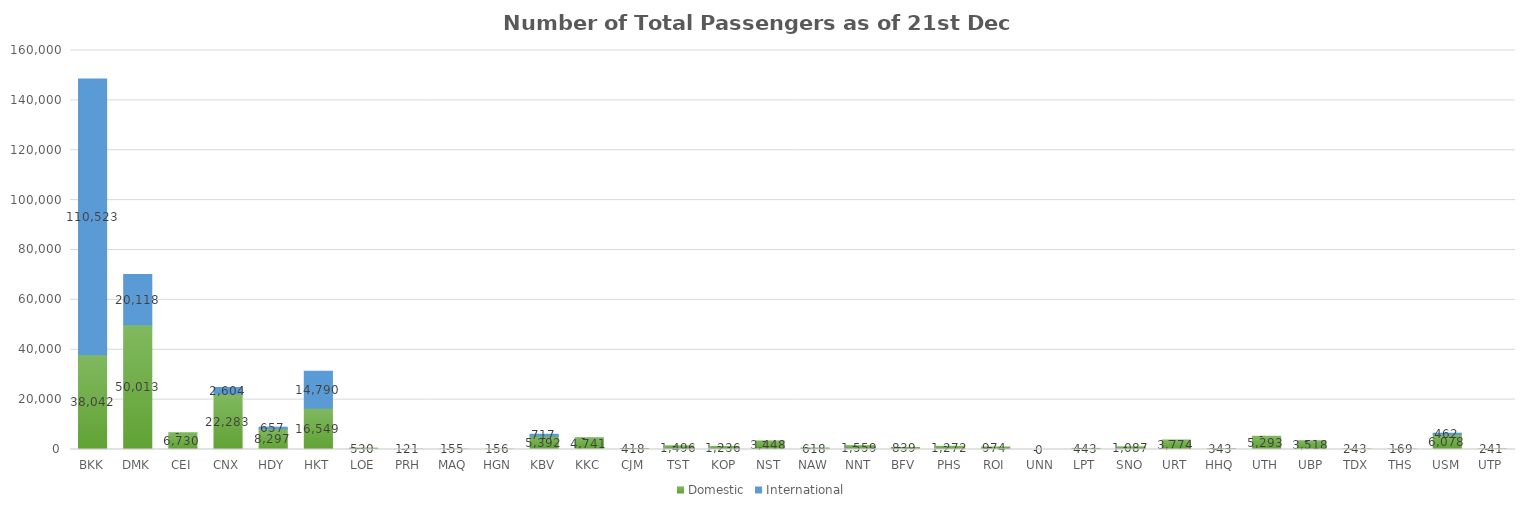
| Category | Domestic | International |
|---|---|---|
| BKK | 38042 | 110523 |
| DMK | 50013 | 20118 |
| CEI | 6730 | 0 |
| CNX | 22283 | 2604 |
| HDY | 8297 | 657 |
| HKT | 16549 | 14790 |
| LOE | 530 | 0 |
| PRH | 121 | 0 |
| MAQ | 155 | 0 |
| HGN | 156 | 0 |
| KBV | 5392 | 717 |
| KKC | 4741 | 0 |
| CJM | 418 | 0 |
| TST | 1496 | 0 |
| KOP | 1236 | 0 |
| NST | 3448 | 0 |
| NAW | 618 | 0 |
| NNT | 1559 | 0 |
| BFV | 839 | 0 |
| PHS | 1272 | 0 |
| ROI | 974 | 0 |
| UNN | 0 | 0 |
| LPT | 443 | 0 |
| SNO | 1087 | 0 |
| URT | 3774 | 0 |
| HHQ | 343 | 0 |
| UTH | 5293 | 0 |
| UBP | 3518 | 0 |
| TDX | 243 | 0 |
| THS | 169 | 0 |
| USM | 6078 | 462 |
| UTP | 241 | 0 |